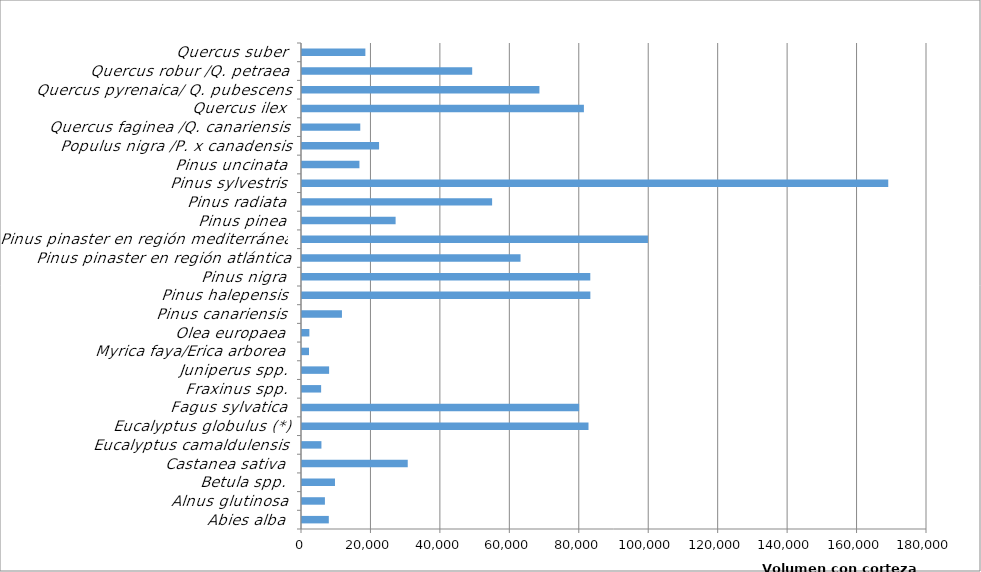
| Category | Series 0 |
|---|---|
| Abies alba | 7721983.504 |
| Alnus glutinosa | 6600442.637 |
| Betula spp. | 9500502.86 |
| Castanea sativa | 30452674.538 |
| Eucalyptus camaldulensis | 5594689 |
| Eucalyptus globulus (*) | 82513814.042 |
| Fagus sylvatica | 79810611.906 |
| Fraxinus spp. | 5508416.848 |
| Juniperus spp. | 7807581.523 |
| Myrica faya/Erica arborea | 2012596.292 |
| Olea europaea | 2119183.677 |
| Pinus canariensis | 11505365.004 |
| Pinus halepensis | 83047755.388 |
| Pinus nigra | 83027292.733 |
| Pinus pinaster en región atlántica | 62934586.52 |
| Pinus pinaster en región mediterránea | 99638282.93 |
| Pinus pinea | 26958719.855 |
| Pinus radiata | 54750959.589 |
| Pinus sylvestris | 168839231.39 |
| Pinus uncinata | 16539236.86 |
| Populus nigra /P. x canadensis | 22193301.336 |
| Quercus faginea /Q. canariensis | 16783540.781 |
| Quercus ilex | 81189079.422 |
| Quercus pyrenaica/ Q. pubescens | 68378961.027 |
| Quercus robur /Q. petraea | 49012963.454 |
| Quercus suber | 18251092.167 |